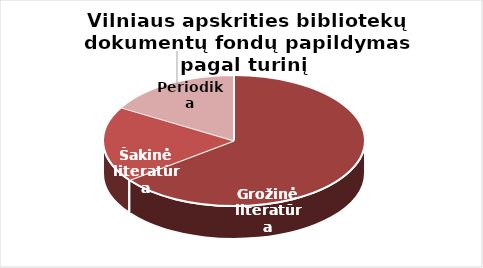
| Category | Series 0 |
|---|---|
| Grožinė literatūra | 55493 |
| Šakinė literatūra | 16050 |
| Periodika | 14201 |